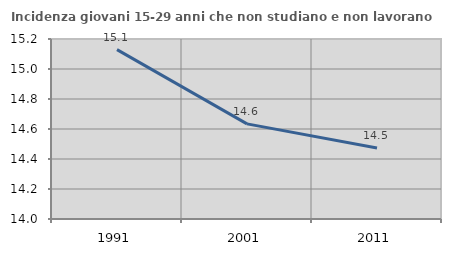
| Category | Incidenza giovani 15-29 anni che non studiano e non lavorano  |
|---|---|
| 1991.0 | 15.129 |
| 2001.0 | 14.634 |
| 2011.0 | 14.474 |